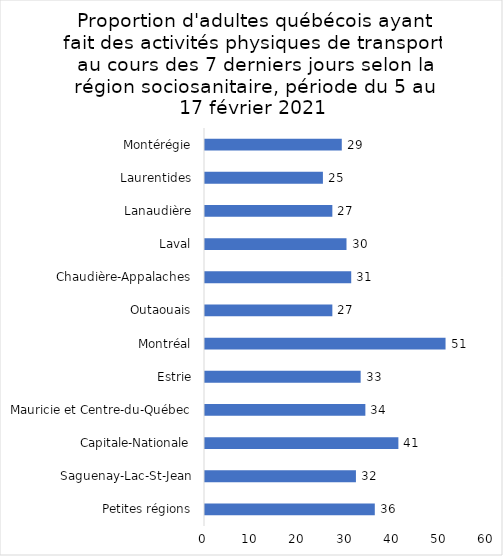
| Category | Series 0 |
|---|---|
| Petites régions | 36 |
| Saguenay-Lac-St-Jean | 32 |
| Capitale-Nationale | 41 |
| Mauricie et Centre-du-Québec | 34 |
| Estrie | 33 |
| Montréal | 51 |
| Outaouais | 27 |
| Chaudière-Appalaches | 31 |
| Laval | 30 |
| Lanaudière | 27 |
| Laurentides | 25 |
| Montérégie | 29 |